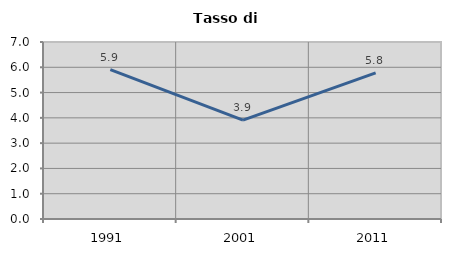
| Category | Tasso di disoccupazione   |
|---|---|
| 1991.0 | 5.91 |
| 2001.0 | 3.91 |
| 2011.0 | 5.777 |